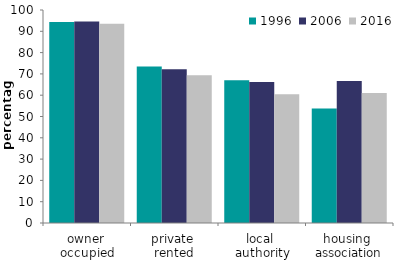
| Category | 1996 | 2006 | 2016 |
|---|---|---|---|
| owner 
occupied | 94.395 | 94.546 | 93.507 |
| private 
rented | 73.427 | 72.153 | 69.331 |
| local 
authority | 67.044 | 66.214 | 60.453 |
| housing 
association | 53.725 | 66.61 | 61.066 |